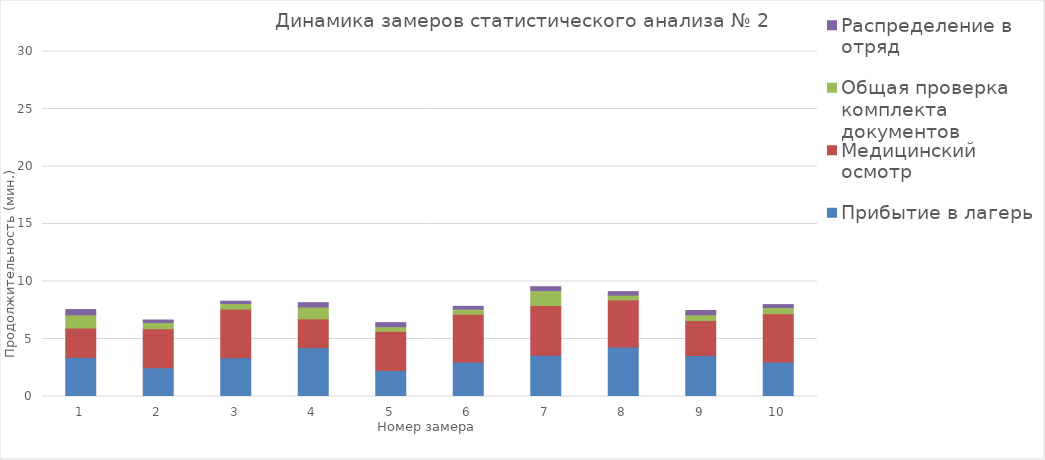
| Category | Прибытие в лагерь | Медицинский осмотр | Общая проверка комплекта документов | Распределение в отряд | Действие 5 | Действие 6 | Действие 7 | Действие 8 | Действие 9 | Действие 10 | Действие 11 | Действие 12 | Действие 13 | Действие 14 | Действие 15 |
|---|---|---|---|---|---|---|---|---|---|---|---|---|---|---|---|
| 0 | 3.4 | 2.55 | 1.15 | 0.46 |  |  |  |  |  |  |  |  |  |  |  |
| 1 | 2.5 | 3.4 | 0.53 | 0.22 |  |  |  |  |  |  |  |  |  |  |  |
| 2 | 3.38 | 4.22 | 0.49 | 0.2 |  |  |  |  |  |  |  |  |  |  |  |
| 3 | 4.25 | 2.5 | 1.03 | 0.38 |  |  |  |  |  |  |  |  |  |  |  |
| 4 | 2.27 | 3.4 | 0.4 | 0.35 |  |  |  |  |  |  |  |  |  |  |  |
| 5 | 3 | 4.15 | 0.45 | 0.24 |  |  |  |  |  |  |  |  |  |  |  |
| 6 | 3.58 | 4.33 | 1.3 | 0.34 |  |  |  |  |  |  |  |  |  |  |  |
| 7 | 4.3 | 4.1 | 0.42 | 0.3 |  |  |  |  |  |  |  |  |  |  |  |
| 8 | 3.56 | 3.05 | 0.5 | 0.37 |  |  |  |  |  |  |  |  |  |  |  |
| 9 | 3 | 4.2 | 0.54 | 0.25 |  |  |  |  |  |  |  |  |  |  |  |